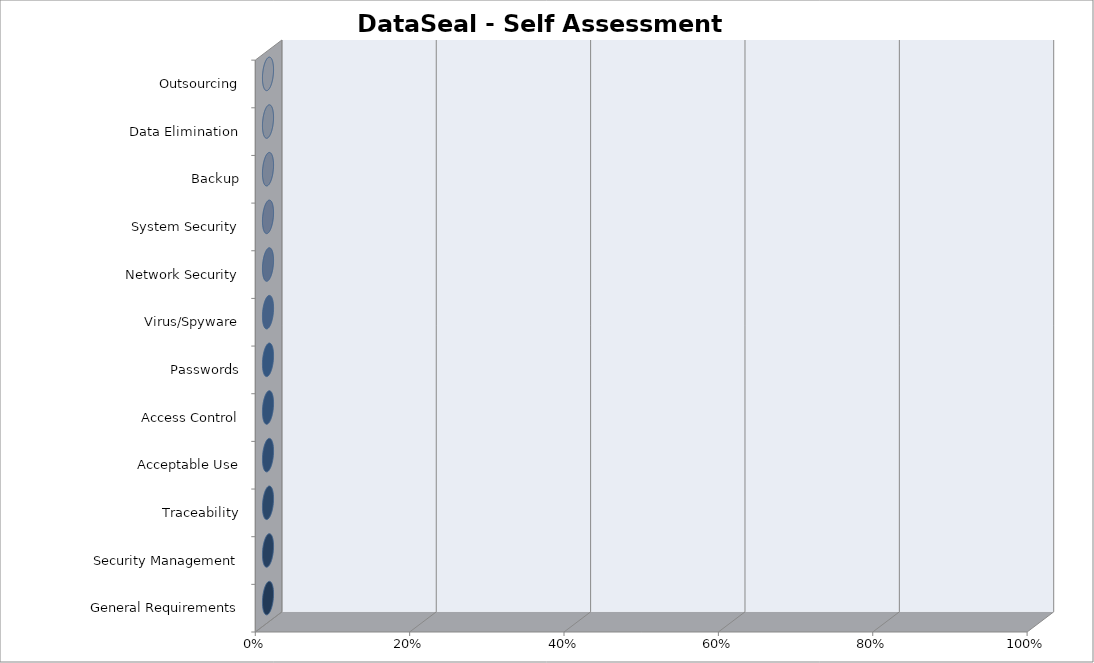
| Category | Series 0 |
|---|---|
| General Requirements | 0 |
| Security Management | 0 |
| Traceability | 0 |
| Acceptable Use | 0 |
| Access Control | 0 |
| Passwords | 0 |
| Virus/Spyware | 0 |
| Network Security | 0 |
| System Security | 0 |
| Backup | 0 |
| Data Elimination | 0 |
| Outsourcing | 0 |